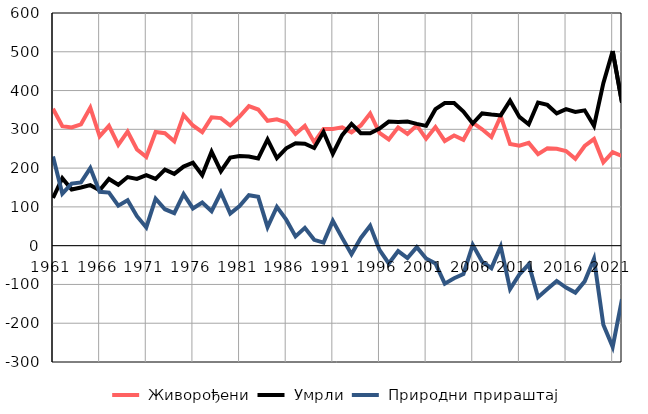
| Category |  Живорођени |  Умрли |  Природни прираштај |
|---|---|---|---|
| 1961.0 | 353 | 123 | 230 |
| 1962.0 | 308 | 174 | 134 |
| 1963.0 | 305 | 145 | 160 |
| 1964.0 | 313 | 150 | 163 |
| 1965.0 | 356 | 156 | 200 |
| 1966.0 | 282 | 143 | 139 |
| 1967.0 | 309 | 172 | 137 |
| 1968.0 | 260 | 157 | 103 |
| 1969.0 | 294 | 177 | 117 |
| 1970.0 | 248 | 172 | 76 |
| 1971.0 | 229 | 182 | 47 |
| 1972.0 | 293 | 172 | 121 |
| 1973.0 | 290 | 196 | 94 |
| 1974.0 | 269 | 185 | 84 |
| 1975.0 | 337 | 204 | 133 |
| 1976.0 | 310 | 214 | 96 |
| 1977.0 | 293 | 182 | 111 |
| 1978.0 | 331 | 242 | 89 |
| 1979.0 | 329 | 192 | 137 |
| 1980.0 | 310 | 227 | 83 |
| 1981.0 | 333 | 231 | 102 |
| 1982.0 | 360 | 230 | 130 |
| 1983.0 | 351 | 225 | 126 |
| 1984.0 | 322 | 274 | 48 |
| 1985.0 | 326 | 226 | 100 |
| 1986.0 | 318 | 251 | 67 |
| 1987.0 | 288 | 264 | 24 |
| 1988.0 | 309 | 263 | 46 |
| 1989.0 | 267 | 252 | 15 |
| 1990.0 | 301 | 293 | 8 |
| 1991.0 | 301 | 237 | 64 |
| 1992.0 | 305 | 285 | 20 |
| 1993.0 | 292 | 314 | -22 |
| 1994.0 | 310 | 290 | 20 |
| 1995.0 | 341 | 290 | 51 |
| 1996.0 | 291 | 302 | -11 |
| 1997.0 | 274 | 320 | -46 |
| 1998.0 | 305 | 319 | -14 |
| 1999.0 | 288 | 320 | -32 |
| 2000.0 | 310 | 314 | -4 |
| 2001.0 | 276 | 309 | -33 |
| 2002.0 | 306 | 352 | -46 |
| 2003.0 | 270 | 368 | -98 |
| 2004.0 | 284 | 368 | -84 |
| 2005.0 | 273 | 346 | -73 |
| 2006.0 | 317 | 315 | 2 |
| 2007.0 | 300 | 341 | -41 |
| 2008.0 | 280 | 338 | -58 |
| 2009.0 | 334 | 336 | -2 |
| 2010.0 | 262 | 374 | -112 |
| 2011.0 | 258 | 332 | -74 |
| 2012.0 | 265 | 313 | -48 |
| 2013.0 | 236 | 369 | -133 |
| 2014.0 | 251 | 363 | -112 |
| 2015.0 | 250 | 341 | -91 |
| 2016.0 | 244 | 352 | -108 |
| 2017.0 | 224 | 345 | -121 |
| 2018.0 | 257 | 349 | -92 |
| 2019.0 | 275 | 309 | -34 |
| 2020.0 | 215 | 419 | -204 |
| 2021.0 | 241 | 502 | -261 |
| 2022.0 | 231 | 369 | -138 |